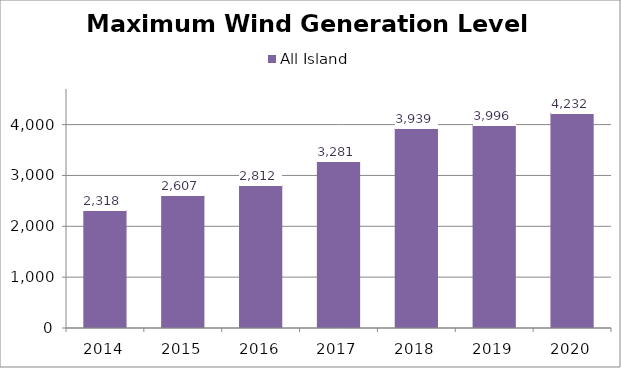
| Category | All Island |
|---|---|
| 2014.0 | 2317.54 |
| 2015.0 | 2606.89 |
| 2016.0 | 2811.574 |
| 2017.0 | 3280.794 |
| 2018.0 | 3938.772 |
| 2019.0 | 3995.966 |
| 2020.0 | 4231.946 |